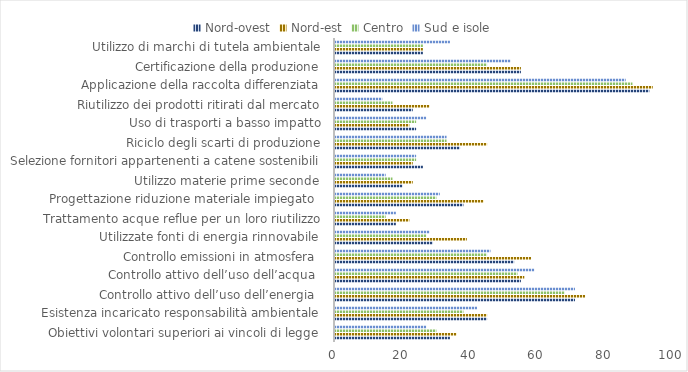
| Category | Nord-ovest | Nord-est | Centro | Sud e isole |
|---|---|---|---|---|
| Obiettivi volontari superiori ai vincoli di legge | 34 | 36 | 30 | 27 |
| Esistenza incaricato responsabilità ambientale | 45 | 45 | 38 | 42 |
| Controllo attivo dell’uso dell’energia  | 71 | 74 | 68 | 71 |
| Controllo attivo dell’uso dell’acqua  | 55 | 56 | 54 | 59 |
| Controllo emissioni in atmosfera  | 53 | 58 | 45 | 46 |
| Utilizzate fonti di energia rinnovabile | 29 | 39 | 27 | 28 |
| Trattamento acque reflue per un loro riutilizzo | 18 | 22 | 15 | 18 |
| Progettazione riduzione materiale impiegato  | 38 | 44 | 30 | 31 |
| Utilizzo materie prime seconde | 20 | 23 | 17 | 15 |
| Selezione fornitori appartenenti a catene sostenibili | 26 | 23 | 24 | 24 |
| Riciclo degli scarti di produzione | 37 | 45 | 33 | 33 |
| Uso di trasporti a basso impatto | 24 | 22 | 24 | 27 |
| Riutilizzo dei prodotti ritirati dal mercato | 23 | 28 | 17 | 14 |
| Applicazione della raccolta differenziata | 93 | 94 | 88 | 86 |
| Certificazione della produzione | 55 | 55 | 45 | 52 |
| Utilizzo di marchi di tutela ambientale | 26 | 26 | 26 | 34 |